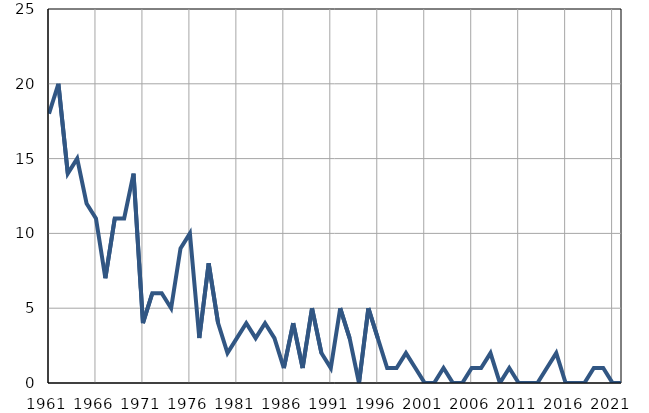
| Category | Умрла 
одојчад |
|---|---|
| 1961.0 | 18 |
| 1962.0 | 20 |
| 1963.0 | 14 |
| 1964.0 | 15 |
| 1965.0 | 12 |
| 1966.0 | 11 |
| 1967.0 | 7 |
| 1968.0 | 11 |
| 1969.0 | 11 |
| 1970.0 | 14 |
| 1971.0 | 4 |
| 1972.0 | 6 |
| 1973.0 | 6 |
| 1974.0 | 5 |
| 1975.0 | 9 |
| 1976.0 | 10 |
| 1977.0 | 3 |
| 1978.0 | 8 |
| 1979.0 | 4 |
| 1980.0 | 2 |
| 1981.0 | 3 |
| 1982.0 | 4 |
| 1983.0 | 3 |
| 1984.0 | 4 |
| 1985.0 | 3 |
| 1986.0 | 1 |
| 1987.0 | 4 |
| 1988.0 | 1 |
| 1989.0 | 5 |
| 1990.0 | 2 |
| 1991.0 | 1 |
| 1992.0 | 5 |
| 1993.0 | 3 |
| 1994.0 | 0 |
| 1995.0 | 5 |
| 1996.0 | 3 |
| 1997.0 | 1 |
| 1998.0 | 1 |
| 1999.0 | 2 |
| 2000.0 | 1 |
| 2001.0 | 0 |
| 2002.0 | 0 |
| 2003.0 | 1 |
| 2004.0 | 0 |
| 2005.0 | 0 |
| 2006.0 | 1 |
| 2007.0 | 1 |
| 2008.0 | 2 |
| 2009.0 | 0 |
| 2010.0 | 1 |
| 2011.0 | 0 |
| 2012.0 | 0 |
| 2013.0 | 0 |
| 2014.0 | 1 |
| 2015.0 | 2 |
| 2016.0 | 0 |
| 2017.0 | 0 |
| 2018.0 | 0 |
| 2019.0 | 1 |
| 2020.0 | 1 |
| 2021.0 | 0 |
| 2022.0 | 0 |